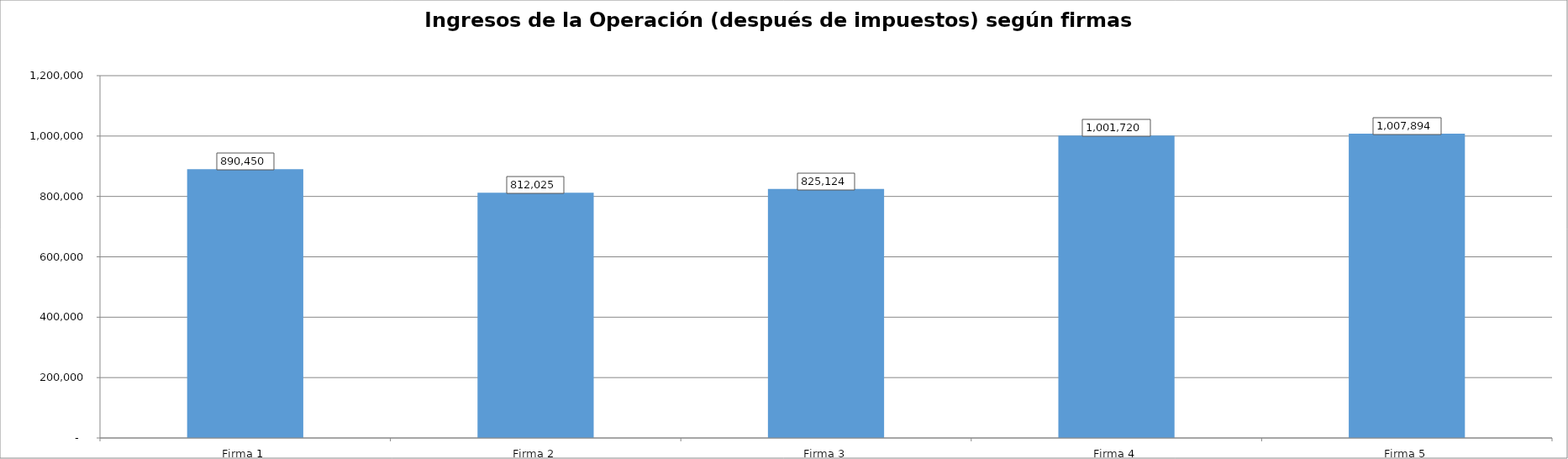
| Category | Ingresos de la Operación (después de impuestos) según firmas simuladas - Año 1 |
|---|---|
| Firma 1 | 890450.022 |
| Firma 2 | 812025.331 |
| Firma 3 | 825124.008 |
| Firma 4 | 1001719.655 |
| Firma 5 | 1007894.408 |